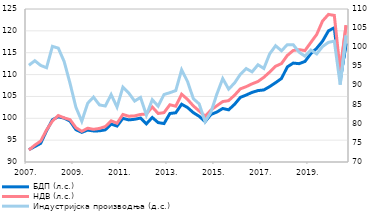
| Category | БДП (л.с.) | НДВ (л.с.) |
|---|---|---|
| 2007. | 92.831 | 92.741 |
| II | 93.526 | 93.864 |
| III | 94.266 | 94.78 |
| IV | 97.145 | 97.33 |
| 2008. | 99.659 | 99.372 |
| II | 100.341 | 100.628 |
| III | 100.028 | 100.086 |
| IV | 99.356 | 99.69 |
| 2009. | 97.389 | 97.843 |
| II | 96.782 | 97.016 |
| III | 97.302 | 97.73 |
| IV | 97.105 | 97.47 |
| 2010. | 97.125 | 97.678 |
| II | 97.356 | 98.101 |
| III | 98.663 | 99.428 |
| IV | 98.219 | 98.86 |
| 2011. | 99.983 | 100.874 |
| II | 99.634 | 100.472 |
| III | 99.77 | 100.549 |
| IV | 100.042 | 100.88 |
| 2012. | 98.729 | 100.977 |
| II | 100.186 | 102.589 |
| III | 99.019 | 101.099 |
| IV | 98.792 | 101.295 |
| 2013. | 101.091 | 103.098 |
| II | 101.261 | 102.765 |
| III | 103.216 | 105.505 |
| IV | 102.464 | 104.329 |
| 2014. | 101.28 | 102.825 |
| II | 100.443 | 101.654 |
| III | 99.229 | 100.468 |
| IV | 100.88 | 101.88 |
| 2015. | 101.427 | 102.869 |
| II | 102.241 | 103.822 |
| III | 101.936 | 104.041 |
| IV | 103.173 | 105.25 |
| 2016. | 104.781 | 106.727 |
| II | 105.322 | 107.243 |
| III | 105.931 | 107.881 |
| IV | 106.337 | 108.418 |
| 2017. | 106.487 | 109.373 |
| II | 107.253 | 110.59 |
| III | 108.145 | 111.903 |
| IV | 109.098 | 112.516 |
| 2018. | 111.752 | 114.381 |
| II | 112.632 | 115.509 |
| III | 112.492 | 115.703 |
| IV | 113.002 | 115.487 |
| 2019. | 114.773 | 117.347 |
| II | 116.013 | 119.176 |
| III | 117.642 | 122.262 |
| IV | 119.996 | 123.763 |
| 2020. | 120.716 | 123.537 |
| II | 108.757 | 110.864 |
| III | 117.131 | 121.288 |